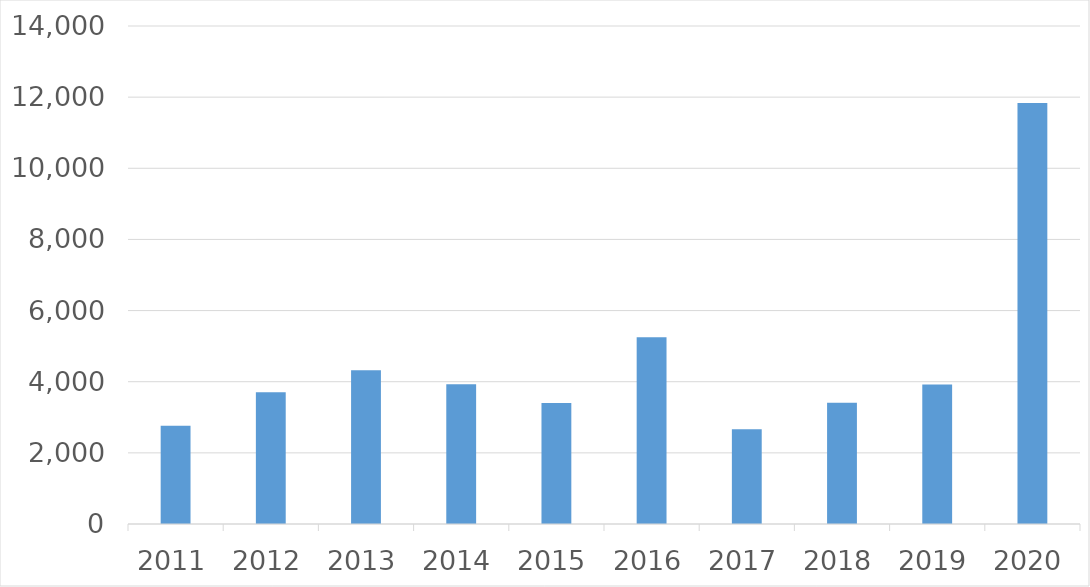
| Category | Series 0 |
|---|---|
| 2011 | 2759 |
| 2012 | 3706 |
| 2013 | 4321 |
| 2014 | 3928 |
| 2015 | 3405 |
| 2016 | 5249 |
| 2017 | 2664 |
| 2018 | 3410 |
| 2019 | 3923 |
| 2020 | 11835 |